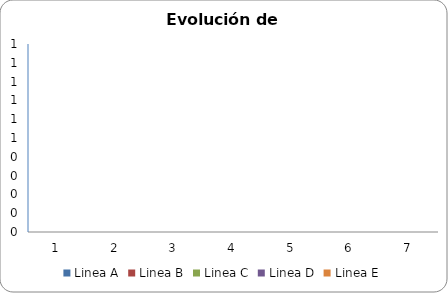
| Category | Linea A | Linea B | Linea C | Linea D | Linea E |
|---|---|---|---|---|---|
| 0 | 0 | 0 | 0 | 0 | 0 |
| 1 | 0 | 0 | 0 | 0 | 0 |
| 2 | 0 | 0 | 0 | 0 | 0 |
| 3 | 0 | 0 | 0 | 0 | 0 |
| 4 | 0 | 0 | 0 | 0 | 0 |
| 5 | 0 | 0 | 0 | 0 | 0 |
| 6 | 0 | 0 | 0 | 0 | 0 |